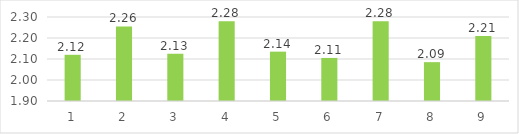
| Category | Series 0 |
|---|---|
| 0 | 2.12 |
| 1 | 2.255 |
| 2 | 2.125 |
| 3 | 2.28 |
| 4 | 2.135 |
| 5 | 2.105 |
| 6 | 2.28 |
| 7 | 2.085 |
| 8 | 2.21 |